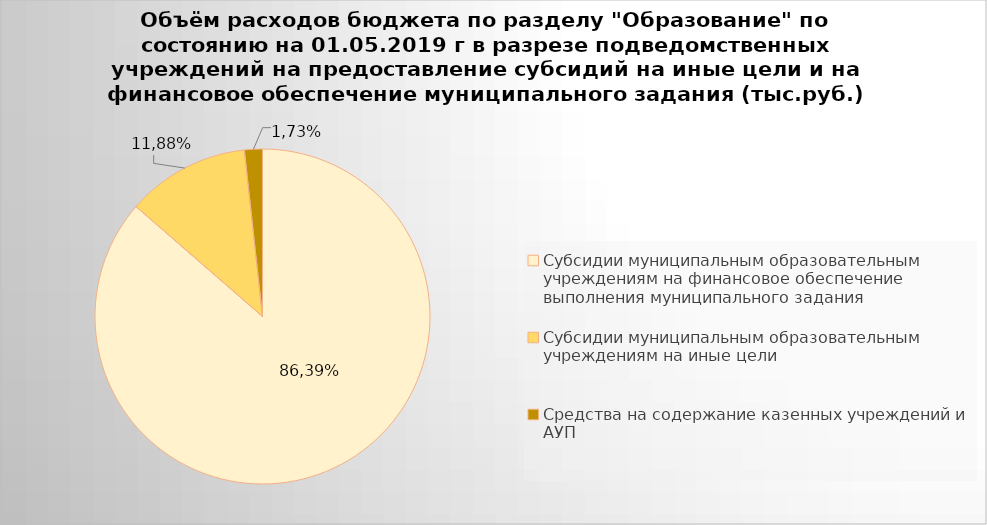
| Category | Series 0 |
|---|---|
| Субсидии муниципальным образовательным учреждениям на финансовое обеспечение выполнения муниципального задания | 4465786.9 |
| Субсидии муниципальным образовательным учреждениям на иные цели | 614448.84 |
| Средства на содержание казенных учреждений и АУП | 89369.9 |